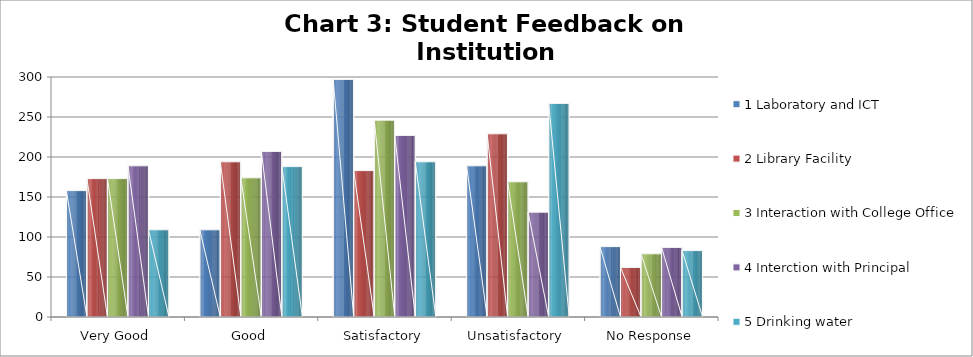
| Category | 1 Laboratory and ICT | 2 Library Facility | 3 Interaction with College Office | 4 Interction with Principal | 5 Drinking water |
|---|---|---|---|---|---|
| Very Good | 158 | 173 | 173 | 189 | 109 |
| Good | 109 | 194 | 174 | 207 | 188 |
| Satisfactory | 297 | 183 | 246 | 227 | 194 |
| Unsatisfactory | 189 | 229 | 169 | 131 | 267 |
| No Response | 88 | 62 | 79 | 87 | 83 |